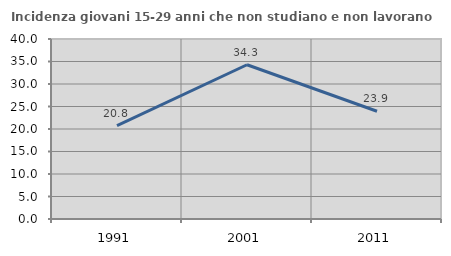
| Category | Incidenza giovani 15-29 anni che non studiano e non lavorano  |
|---|---|
| 1991.0 | 20.757 |
| 2001.0 | 34.275 |
| 2011.0 | 23.94 |